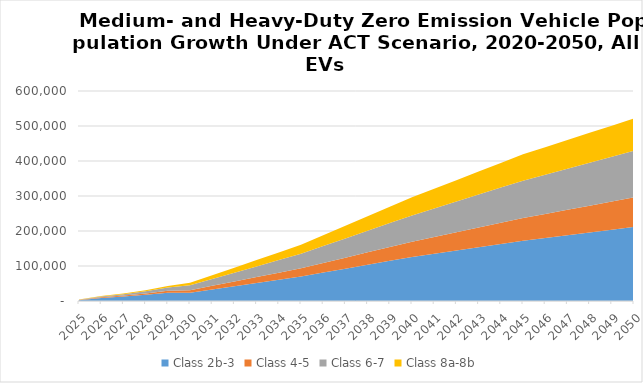
| Category | Class 2b-3 | Class 4-5 | Class 6-7 | Class 8a-8b |
|---|---|---|---|---|
| 2025.0 | 2046.527 | 790.941 | 1071.185 | 602.322 |
| 2026.0 | 8724.55 | 1651.338 | 2362.168 | 1291.27 |
| 2027.0 | 12759.788 | 2636.882 | 3984.124 | 2113.363 |
| 2028.0 | 17612.918 | 3915.627 | 6249.706 | 3147.119 |
| 2029.0 | 23432.924 | 5533.796 | 9332.17 | 4452.434 |
| 2030.0 | 23428.29 | 7640.015 | 13616.853 | 7182.419 |
| 2031.0 | 32738.382 | 10815.527 | 19190.216 | 10866.898 |
| 2032.0 | 42048.475 | 13991.039 | 24763.579 | 14551.377 |
| 2033.0 | 51358.567 | 17166.552 | 30336.943 | 18235.856 |
| 2034.0 | 60668.659 | 20342.064 | 35910.306 | 21920.335 |
| 2035.0 | 69978.752 | 23517.576 | 41483.669 | 25604.815 |
| 2036.0 | 81162.89 | 27532.681 | 48191.99 | 30801.431 |
| 2037.0 | 92347.028 | 31547.787 | 54900.31 | 35998.047 |
| 2038.0 | 103531.166 | 35562.892 | 61608.631 | 41194.664 |
| 2039.0 | 114715.304 | 39577.998 | 68316.951 | 46391.28 |
| 2040.0 | 125899.442 | 43593.103 | 75025.272 | 51587.896 |
| 2041.0 | 135158.544 | 47836.011 | 81397.943 | 56293.517 |
| 2042.0 | 144417.645 | 52078.919 | 87770.613 | 60999.137 |
| 2043.0 | 153676.746 | 56321.826 | 94143.284 | 65704.758 |
| 2044.0 | 162935.847 | 60564.734 | 100515.954 | 70410.378 |
| 2045.0 | 172194.949 | 64807.642 | 106888.625 | 75115.998 |
| 2046.0 | 180067.966 | 68760.528 | 112106.615 | 78568.97 |
| 2047.0 | 187940.984 | 72713.413 | 117324.605 | 82021.942 |
| 2048.0 | 195814.002 | 76666.299 | 122542.595 | 85474.914 |
| 2049.0 | 203687.02 | 80619.185 | 127760.585 | 88927.887 |
| 2050.0 | 211560.038 | 84572.071 | 132978.575 | 92380.859 |